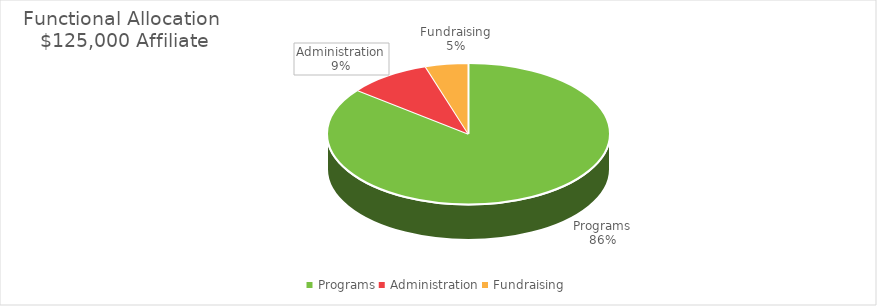
| Category | Series 0 | Series 1 |
|---|---|---|
| Programs | 100100 | 0.801 |
| Administration | 11100 | 0.089 |
| Fundraising | 5750 | 0.046 |